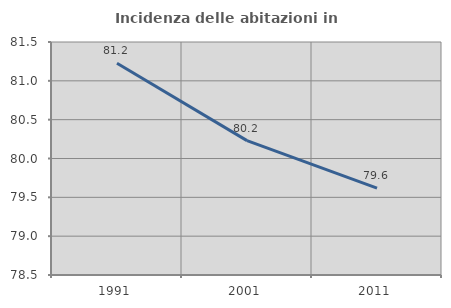
| Category | Incidenza delle abitazioni in proprietà  |
|---|---|
| 1991.0 | 81.227 |
| 2001.0 | 80.23 |
| 2011.0 | 79.618 |